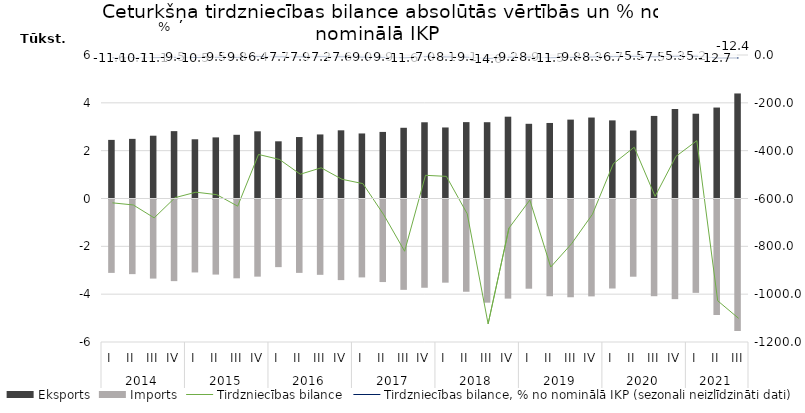
| Category | Eksports | Imports |
|---|---|---|
| 0 | 2450.7 | -3068.8 |
| 1 | 2493.4 | -3120.5 |
| 2 | 2625.5 | -3306.5 |
| 3 | 2816.7 | -3413.2 |
| 4 | 2476.5 | -3050.1 |
| 5 | 2555.2 | -3139.2 |
| 6 | 2663.4 | -3295.5 |
| 7 | 2809.5 | -3225.4 |
| 8 | 2391.5 | -2828.1 |
| 9 | 2569.5 | -3068 |
| 10 | 2678.2 | -3149.9 |
| 11 | 2850.8 | -3370.5 |
| 12 | 2719.6 | -3257.4 |
| 13 | 2783.8 | -3452 |
| 14 | 2956.9 | -3777.4 |
| 15 | 3187 | -3690 |
| 16 | 2969.9 | -3477.4 |
| 17 | 3193.3 | -3857.4 |
| 18 | 3189.7 | -4313.9 |
| 19 | 3420.5 | -4144.2 |
| 20 | 3123.6 | -3730.2 |
| 21 | 3158.2 | -4044.8 |
| 22 | 3298.5 | -4087.5 |
| 23 | 3385.3 | -4051.1 |
| 24 | 3266.4 | -3720.9 |
| 25 | 2842.7 | -3228.3 |
| 26 | 3452.8 | -4043.7 |
| 27 | 3742.7 | -4166.6 |
| 28 | 3545 | -3903.3 |
| 29 | 3802.9 | -4830.5 |
| 30 | 4392.2 | -5493.2 |